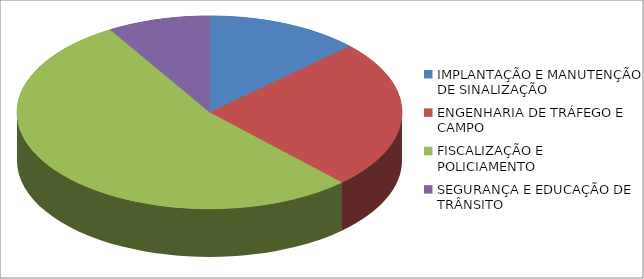
| Category | Series 0 | Series 1 |
|---|---|---|
| IMPLANTAÇÃO E MANUTENÇÃO DE SINALIZAÇÃO | 761201.75 |  |
| ENGENHARIA DE TRÁFEGO E CAMPO | 1466464.55 |  |
| FISCALIZAÇÃO E POLICIAMENTO | 3135885.58 |  |
| SEGURANÇA E EDUCAÇÃO DE TRÂNSITO | 506719.2 |  |